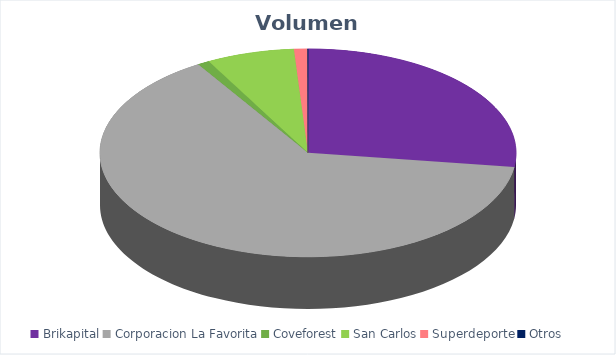
| Category | VOLUMEN ($USD) |
|---|---|
| Brikapital | 74000 |
| Corporacion La Favorita | 174364.94 |
| Coveforest | 2501.2 |
| San Carlos | 18612 |
| Superdeporte | 2843.5 |
| Otros | 97.75 |